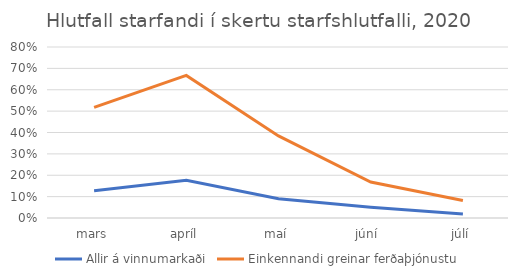
| Category | Allir á vinnumarkaði | Einkennandi greinar ferðaþjónustu |
|---|---|---|
| mars | 0.128 | 0.517 |
| apríl | 0.177 | 0.667 |
| maí | 0.09 | 0.384 |
| júní  | 0.05 | 0.168 |
| júlí | 0.019 | 0.082 |